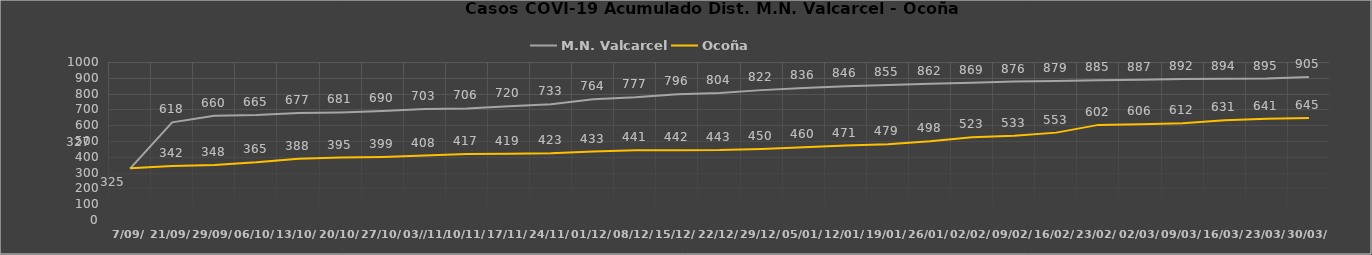
| Category | M.N. Valcarcel | Ocoña |
|---|---|---|
| 7/09/ | 325 | 327 |
| 21/09/ | 618 | 342 |
| 29/09/ | 660 | 348 |
| 06/10/ | 665 | 365 |
| 13/10/ | 677 | 388 |
| 20/10/ | 681 | 395 |
| 27/10/ | 690 | 399 |
| 03//11/ | 703 | 408 |
| 10/11/ | 706 | 417 |
| 17/11/ | 720 | 419 |
| 24/11/ | 733 | 423 |
| 01/12/ | 764 | 433 |
| 08/12/ | 777 | 441 |
| 15/12/ | 796 | 442 |
| 22/12/ | 804 | 443 |
| 29/12/ | 822 | 450 |
| 05/01/ | 836 | 460 |
| 12/01/ | 846 | 471 |
| 19/01/ | 855 | 479 |
| 26/01/ | 862 | 498 |
| 02/02/ | 869 | 523 |
| 09/02/ | 876 | 533 |
| 16/02/ | 879 | 553 |
| 23/02/ | 885 | 602 |
| 02/03/ | 887 | 606 |
| 09/03/ | 892 | 612 |
| 16/03/ | 894 | 631 |
| 23/03/ | 895 | 641 |
| 30/03/ | 905 | 645 |